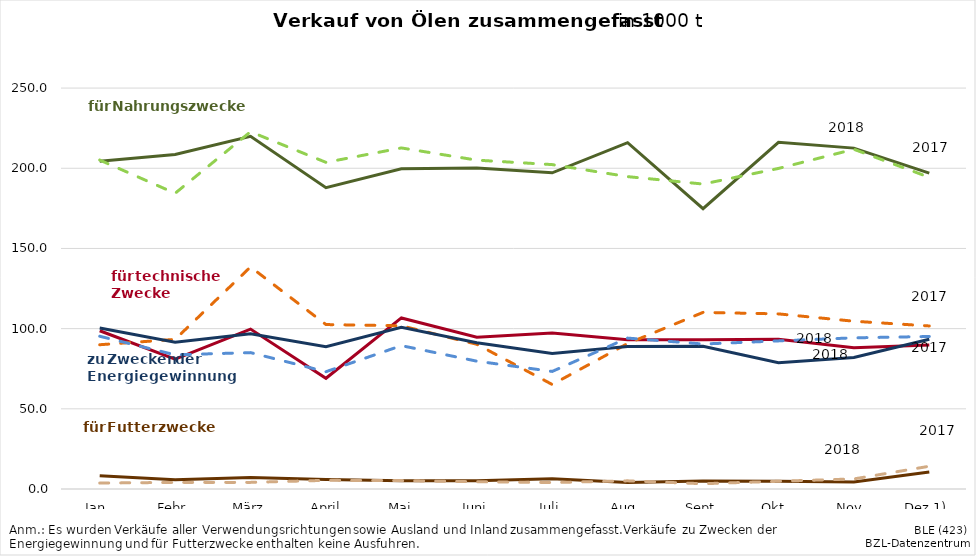
| Category | Series 0 | Series 1 | Series 2 | Series 3 | Series 4 | Series 5 | Series 6 | Series 7 |
|---|---|---|---|---|---|---|---|---|
| Jan. | 204.316 | 205.137 | 8.309 | 3.698 | 98.688 | 89.962 | 100.37 | 95.257 |
|  Febr. | 208.562 | 184.402 | 5.714 | 4.123 | 80.933 | 93.309 | 91.472 | 83.662 |
| März | 219.932 | 222.776 | 7.167 | 4.128 | 99.709 | 138.47 | 96.75 | 85.046 |
|  April | 187.908 | 203.693 | 5.864 | 5.405 | 69.038 | 102.542 | 88.678 | 73.14 |
|  Mai | 199.664 | 212.672 | 5.198 | 5.244 | 106.673 | 101.773 | 100.818 | 89.401 |
| Juni | 200.134 | 205.073 | 5.213 | 4.511 | 94.604 | 90.244 | 91.221 | 79.717 |
| Juli | 197.145 | 202.293 | 6.382 | 4.03 | 97.285 | 65.175 | 84.44 | 73.312 |
| Aug. | 215.966 | 194.789 | 3.994 | 5.084 | 93.006 | 90.719 | 88.921 | 94.101 |
|  Sept. | 174.809 | 190.164 | 5.022 | 3.286 | 93.027 | 110.131 | 89.009 | 90.405 |
| Okt. | 216.202 | 199.902 | 4.799 | 4.831 | 93.388 | 109.195 | 78.788 | 92.361 |
| Nov. | 212.561 | 211.841 | 4.339 | 6.273 | 88.132 | 104.624 | 82.059 | 94.263 |
| Dez 1) | 197.015 | 194.362 | 10.584 | 14.188 | 89.73 | 101.669 | 93.363 | 95.101 |